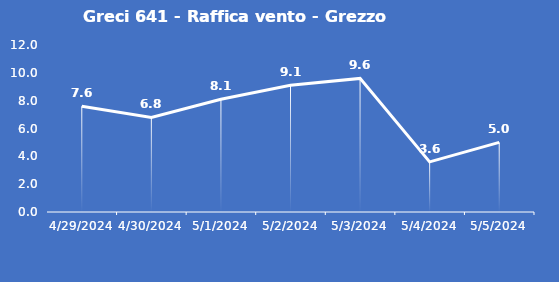
| Category | Greci 641 - Raffica vento - Grezzo (m/s) |
|---|---|
| 4/29/24 | 7.6 |
| 4/30/24 | 6.8 |
| 5/1/24 | 8.1 |
| 5/2/24 | 9.1 |
| 5/3/24 | 9.6 |
| 5/4/24 | 3.6 |
| 5/5/24 | 5 |